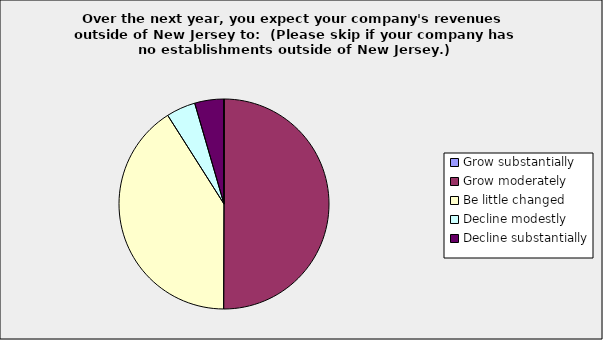
| Category | Series 0 |
|---|---|
| Grow substantially | 0 |
| Grow moderately | 0.5 |
| Be little changed | 0.409 |
| Decline modestly | 0.045 |
| Decline substantially | 0.045 |